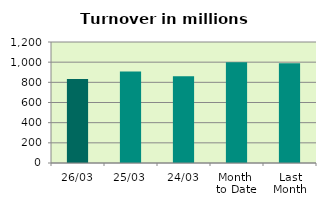
| Category | Series 0 |
|---|---|
| 26/03 | 832.277 |
| 25/03 | 907.434 |
| 24/03 | 860.568 |
| Month 
to Date | 1000.254 |
| Last
Month | 989.924 |